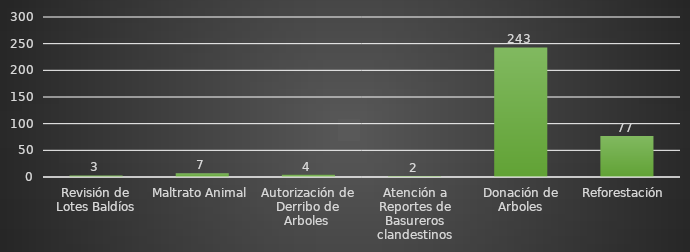
| Category | INDICADOR  |
|---|---|
| Revisión de Lotes Baldíos | 3 |
| Maltrato Animal | 7 |
| Autorización de Derribo de Arboles  | 4 |
| Atención a Reportes de Basureros clandestinos | 2 |
| Donación de Arboles | 243 |
| Reforestación  | 77 |